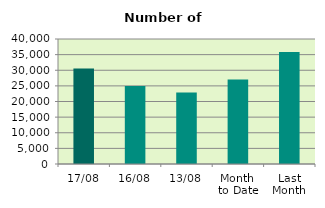
| Category | Series 0 |
|---|---|
| 17/08 | 30530 |
| 16/08 | 24988 |
| 13/08 | 22866 |
| Month 
to Date | 27020.5 |
| Last
Month | 35875.545 |